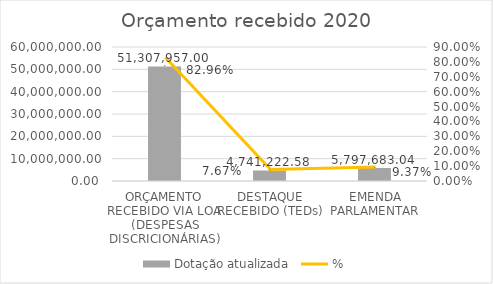
| Category | Dotação atualizada |
|---|---|
| ORÇAMENTO RECEBIDO VIA LOA (DESPESAS DISCRICIONÁRIAS) | 51307957 |
| DESTAQUE RECEBIDO (TEDs) | 4741222.58 |
| EMENDA PARLAMENTAR | 5797683.04 |